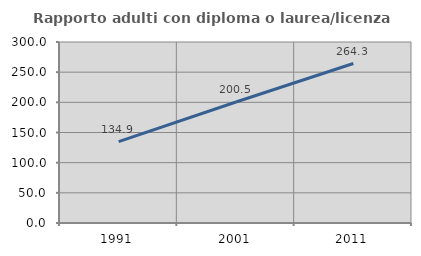
| Category | Rapporto adulti con diploma o laurea/licenza media  |
|---|---|
| 1991.0 | 134.869 |
| 2001.0 | 200.485 |
| 2011.0 | 264.296 |